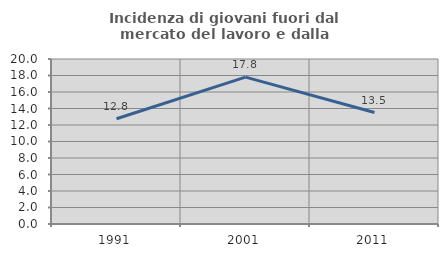
| Category | Incidenza di giovani fuori dal mercato del lavoro e dalla formazione  |
|---|---|
| 1991.0 | 12.76 |
| 2001.0 | 17.799 |
| 2011.0 | 13.507 |